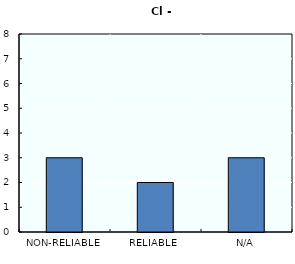
| Category | Series 0 |
|---|---|
| NON-RELIABLE | 3 |
| RELIABLE | 2 |
| N/A | 3 |